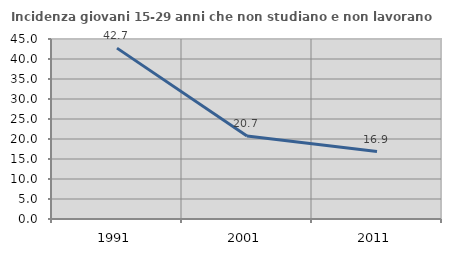
| Category | Incidenza giovani 15-29 anni che non studiano e non lavorano  |
|---|---|
| 1991.0 | 42.718 |
| 2001.0 | 20.741 |
| 2011.0 | 16.872 |